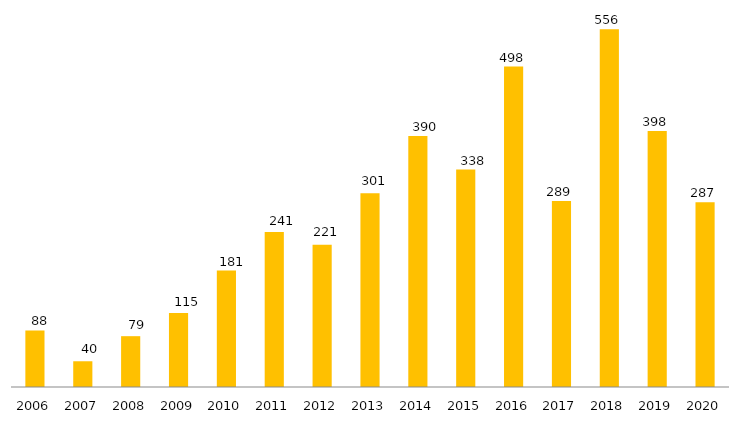
| Category | TOTAL |
|---|---|
| 2006.0 | 88 |
| 2007.0 | 40 |
| 2008.0 | 79 |
| 2009.0 | 115 |
| 2010.0 | 181 |
| 2011.0 | 241 |
| 2012.0 | 221 |
| 2013.0 | 301 |
| 2014.0 | 390 |
| 2015.0 | 338 |
| 2016.0 | 498 |
| 2017.0 | 289 |
| 2018.0 | 556 |
| 2019.0 | 398 |
| 2020.0 | 287 |